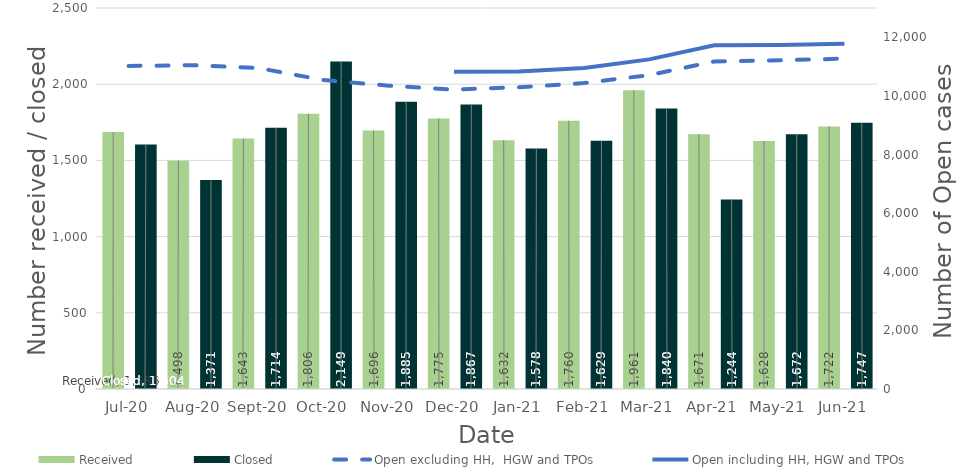
| Category | Received | Closed |
|---|---|---|
| 2020-07-01 | 1686 | 1604 |
| 2020-08-01 | 1498 | 1371 |
| 2020-09-01 | 1643 | 1714 |
| 2020-10-01 | 1806 | 2149 |
| 2020-11-01 | 1696 | 1885 |
| 2020-12-01 | 1775 | 1867 |
| 2021-01-01 | 1632 | 1578 |
| 2021-02-01 | 1760 | 1629 |
| 2021-03-01 | 1961 | 1840 |
| 2021-04-01 | 1671 | 1244 |
| 2021-05-01 | 1628 | 1672 |
| 2021-06-01 | 1722 | 1747 |